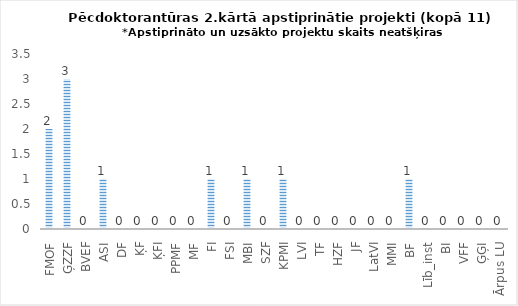
| Category | Series 0 |
|---|---|
| FMOF | 2 |
| ĢZZF | 3 |
| BVEF | 0 |
| ASI | 1 |
| DF | 0 |
| ĶF | 0 |
| ĶFI | 0 |
| PPMF | 0 |
| MF | 0 |
| FI | 1 |
| FSI | 0 |
| MBI | 1 |
| SZF | 0 |
| KPMI | 1 |
| LVI | 0 |
| TF | 0 |
| HZF | 0 |
| JF | 0 |
| LatVI | 0 |
| MMI | 0 |
| BF | 1 |
| Līb_inst | 0 |
| BI | 0 |
| VFF | 0 |
| ĢĢI | 0 |
| Ārpus LU | 0 |